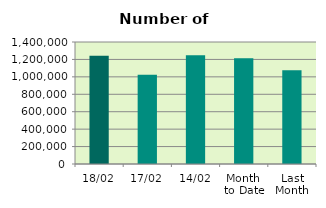
| Category | Series 0 |
|---|---|
| 18/02 | 1241440 |
| 17/02 | 1023792 |
| 14/02 | 1249144 |
| Month 
to Date | 1212127.167 |
| Last
Month | 1075899.909 |